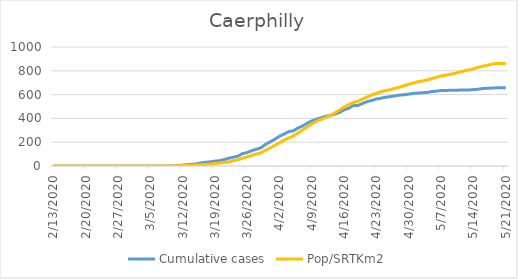
| Category | Cumulative cases | Pop/SRTKm2 |
|---|---|---|
| 5/21/20 | 657 | 861.19 |
| 5/20/20 | 657 | 861.19 |
| 5/19/20 | 657 | 860.987 |
| 5/18/20 | 655 | 856.267 |
| 5/17/20 | 653 | 846.22 |
| 5/16/20 | 651 | 838.734 |
| 5/15/20 | 645 | 828.215 |
| 5/14/20 | 642 | 816.549 |
| 5/13/20 | 639 | 808.457 |
| 5/12/20 | 639 | 799.151 |
| 5/11/20 | 638 | 789.913 |
| 5/10/20 | 636 | 778.449 |
| 5/9/20 | 636 | 771.773 |
| 5/8/20 | 635 | 763.412 |
| 5/7/20 | 635 | 756.668 |
| 5/6/20 | 628 | 745.542 |
| 5/5/20 | 626 | 734.415 |
| 5/4/20 | 618 | 723.693 |
| 5/3/20 | 616 | 715.062 |
| 5/2/20 | 613 | 708.723 |
| 5/1/20 | 610 | 697.462 |
| 4/30/20 | 604 | 686.807 |
| 4/29/20 | 599 | 673.86 |
| 4/28/20 | 596 | 662.869 |
| 4/27/20 | 589 | 653.023 |
| 4/26/20 | 583 | 641.964 |
| 4/25/20 | 578 | 633.94 |
| 4/24/20 | 570 | 624.836 |
| 4/23/20 | 563 | 610.878 |
| 4/22/20 | 551 | 597.526 |
| 4/21/20 | 541 | 580.6 |
| 4/20/20 | 526 | 563.539 |
| 4/19/20 | 509 | 544.995 |
| 4/18/20 | 508 | 532.992 |
| 4/17/20 | 485 | 516.606 |
| 4/16/20 | 473 | 494.892 |
| 4/15/20 | 449 | 470.684 |
| 4/14/20 | 437 | 446.745 |
| 4/13/20 | 425 | 425.841 |
| 4/12/20 | 418 | 407.836 |
| 4/11/20 | 405 | 391.45 |
| 4/10/20 | 393 | 374.996 |
| 4/9/20 | 379 | 354.766 |
| 4/8/20 | 359 | 328.467 |
| 4/7/20 | 336 | 302.64 |
| 4/6/20 | 319 | 277.285 |
| 4/5/20 | 296 | 251.728 |
| 4/4/20 | 289 | 236.825 |
| 4/3/20 | 269 | 217.877 |
| 4/2/20 | 250 | 196.028 |
| 4/1/20 | 225 | 173.573 |
| 3/31/20 | 203 | 151.994 |
| 3/30/20 | 182 | 133.72 |
| 3/29/20 | 154 | 111.197 |
| 3/28/20 | 141 | 100.678 |
| 3/27/20 | 129 | 89.484 |
| 3/26/20 | 113 | 77.009 |
| 3/25/20 | 104 | 65.275 |
| 3/24/20 | 83 | 52.935 |
| 3/23/20 | 74 | 43.832 |
| 3/22/20 | 65 | 35.065 |
| 3/21/20 | 54 | 29.94 |
| 3/20/20 | 45 | 24.883 |
| 3/19/20 | 41 | 20.028 |
| 3/18/20 | 35 | 15.982 |
| 3/17/20 | 31 | 13.622 |
| 3/16/20 | 26 | 11.126 |
| 3/15/20 | 18 | 8.834 |
| 3/14/20 | 14 | 6.878 |
| 3/13/20 | 11 | 5.597 |
| 3/12/20 | 7 | 3.776 |
| 3/11/20 | 3 | 2.158 |
| 3/10/20 | 1 | 1.214 |
| 3/9/20 | 0 | 0.472 |
| 3/8/20 | 0 | 0.27 |
| 3/7/20 | 0 | 0.27 |
| 3/6/20 | 0 | 0.135 |
| 3/5/20 | 0 | 0.135 |
| 3/4/20 | 0 | 0.135 |
| 3/3/20 | 0 | 0.067 |
| 3/2/20 | 0 | 0.067 |
| 3/1/20 | 0 | 0.067 |
| 2/29/20 | 0 | 0.067 |
| 2/28/20 | 0 | 0.067 |
| 2/27/20 | 0 | 0.067 |
| 2/26/20 | 0 | 0 |
| 2/25/20 | 0 | 0 |
| 2/24/20 | 0 | 0 |
| 2/23/20 | 0 | 0 |
| 2/22/20 | 0 | 0 |
| 2/21/20 | 0 | 0 |
| 2/20/20 | 0 | 0 |
| 2/19/20 | 0 | 0 |
| 2/18/20 | 0 | 0 |
| 2/17/20 | 0 | 0 |
| 2/16/20 | 0 | 0 |
| 2/15/20 | 0 | 0 |
| 2/14/20 | 0 | 0 |
| 2/13/20 | 0 | 0 |